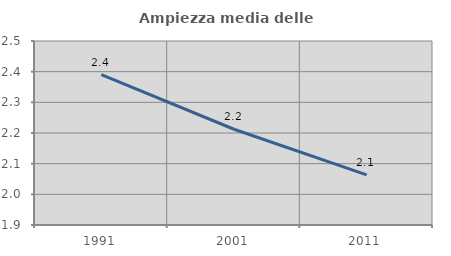
| Category | Ampiezza media delle famiglie |
|---|---|
| 1991.0 | 2.39 |
| 2001.0 | 2.212 |
| 2011.0 | 2.064 |